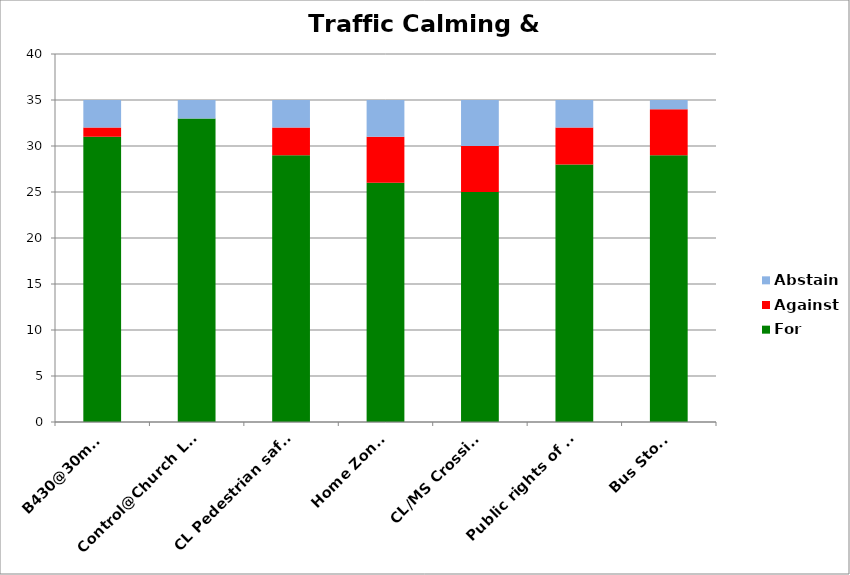
| Category | For | Against | Abstain |
|---|---|---|---|
| B430@30mph | 31 | 1 | 3 |
| Control@Church Lane | 33 | 0 | 2 |
| CL Pedestrian safety | 29 | 3 | 3 |
| Home Zones | 26 | 5 | 4 |
| CL/MS Crossing | 25 | 5 | 5 |
| Public rights of way | 28 | 4 | 3 |
| Bus Stops | 29 | 5 | 1 |